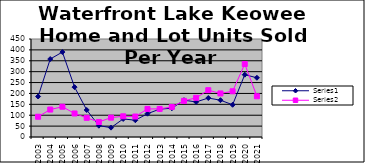
| Category | Series 0 | Series 1 |
|---|---|---|
| 2003.0 | 186 | 93 |
| 2004.0 | 358 | 126 |
| 2005.0 | 390 | 139 |
| 2006.0 | 229 | 108 |
| 2007.0 | 124 | 88 |
| 2008.0 | 52 | 69 |
| 2009.0 | 43 | 89 |
| 2010.0 | 83 | 95 |
| 2011.0 | 77 | 94 |
| 2012.0 | 107 | 129 |
| 2013.0 | 128 | 129 |
| 2014.0 | 132 | 138 |
| 2015.0 | 169 | 166 |
| 2016.0 | 161 | 180 |
| 2017.0 | 179 | 215 |
| 2018.0 | 169 | 200 |
| 2019.0 | 148 | 210 |
| 2020.0 | 286 | 335 |
| 2021.0 | 272 | 187 |